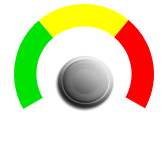
| Category | PIE |
|---|---|
| 0 | 2 |
| 1 | 0.18 |
| 2 | 11.32 |